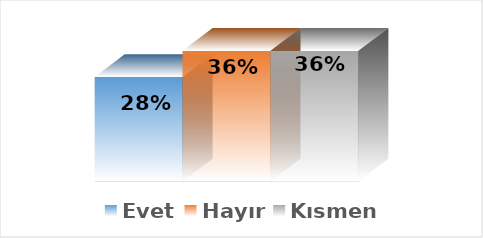
| Category | Evet | Hayır | Kısmen |
|---|---|---|---|
| 0 | 0.286 | 0.357 | 0.357 |